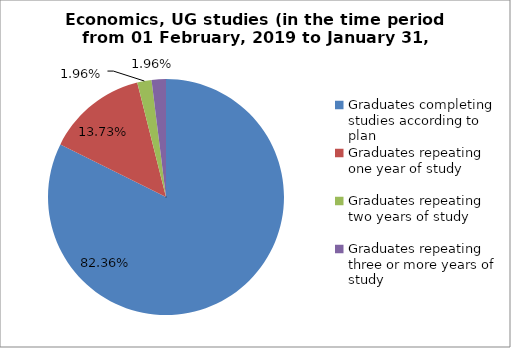
| Category | Series 0 |
|---|---|
| Graduates completing studies according to plan | 82.353 |
| Graduates repeating one year of study | 13.725 |
| Graduates repeating two years of study | 1.961 |
| Graduates repeating three or more years of study | 1.961 |